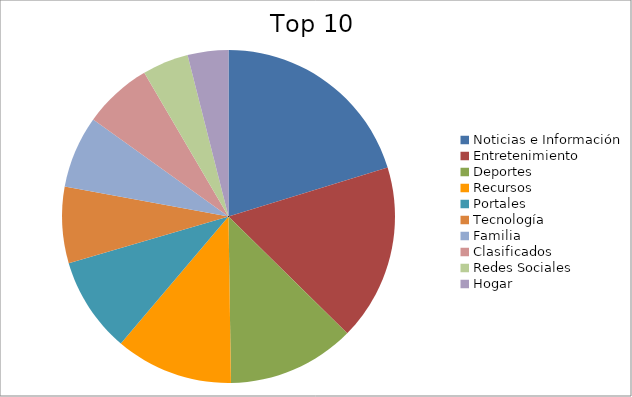
| Category | Series 0 |
|---|---|
| Noticias e Información | 17.3 |
| Entretenimiento | 14.62 |
| Deportes | 10.59 |
| Recursos | 9.76 |
| Portales | 7.92 |
| Tecnología | 6.33 |
| Familia | 6 |
| Clasificados | 5.69 |
| Redes Sociales | 3.83 |
| Hogar | 3.38 |